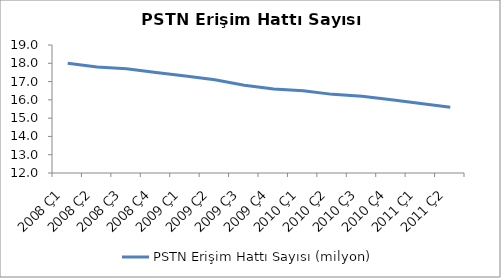
| Category | PSTN Erişim Hattı Sayısı (milyon) |
|---|---|
| 2008 Ç1 | 18 |
| 2008 Ç2 | 17.8 |
| 2008 Ç3 | 17.7 |
| 2008 Ç4 | 17.5 |
| 2009 Ç1 | 17.3 |
| 2009 Ç2 | 17.1 |
| 2009 Ç3 | 16.8 |
| 2009 Ç4 | 16.6 |
| 2010 Ç1 | 16.5 |
| 2010 Ç2 | 16.3 |
| 2010 Ç3 | 16.2 |
| 2010 Ç4 | 16 |
| 2011 Ç1 | 15.8 |
| 2011 Ç2 | 15.6 |